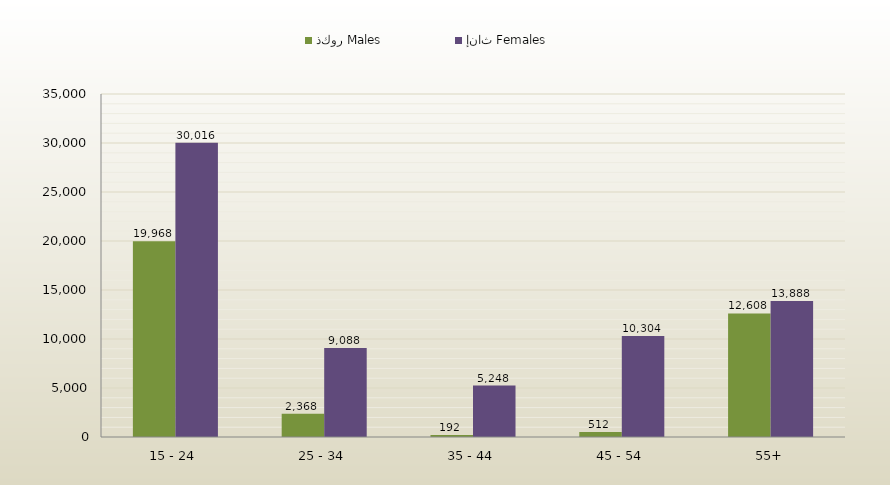
| Category | ذكور Males | إناث Females |
|---|---|---|
| 15 - 24 | 19968 | 30016 |
| 25 - 34 | 2368 | 9088 |
| 35 - 44 | 192 | 5248 |
| 45 - 54 | 512 | 10304 |
| 55+ | 12608 | 13888 |